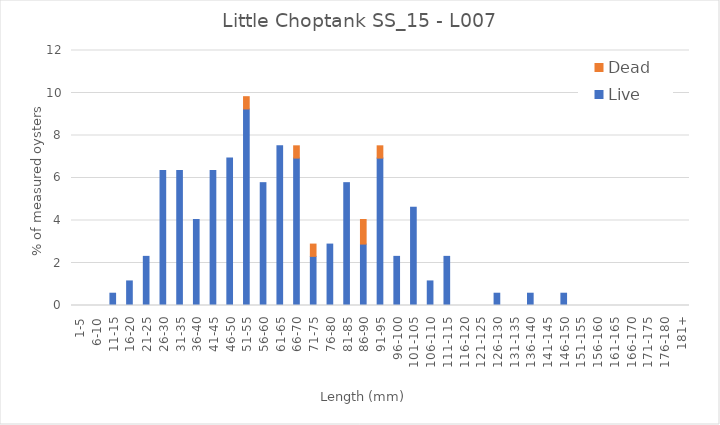
| Category | Live | Dead |
|---|---|---|
| 1-5 | 0 | 0 |
| 6-10 | 0 | 0 |
| 11-15 | 0.578 | 0 |
| 16-20 | 1.156 | 0 |
| 21-25 | 2.312 | 0 |
| 26-30 | 6.358 | 0 |
| 31-35 | 6.358 | 0 |
| 36-40 | 4.046 | 0 |
| 41-45 | 6.358 | 0 |
| 46-50 | 6.936 | 0 |
| 51-55 | 9.249 | 0.578 |
| 56-60 | 5.78 | 0 |
| 61-65 | 7.514 | 0 |
| 66-70 | 6.936 | 0.578 |
| 71-75 | 2.312 | 0.578 |
| 76-80 | 2.89 | 0 |
| 81-85 | 5.78 | 0 |
| 86-90 | 2.89 | 1.156 |
| 91-95 | 6.936 | 0.578 |
| 96-100 | 2.312 | 0 |
| 101-105 | 4.624 | 0 |
| 106-110 | 1.156 | 0 |
| 111-115 | 2.312 | 0 |
| 116-120 | 0 | 0 |
| 121-125 | 0 | 0 |
| 126-130 | 0.578 | 0 |
| 131-135 | 0 | 0 |
| 136-140 | 0.578 | 0 |
| 141-145 | 0 | 0 |
| 146-150 | 0.578 | 0 |
| 151-155 | 0 | 0 |
| 156-160 | 0 | 0 |
| 161-165 | 0 | 0 |
| 166-170 | 0 | 0 |
| 171-175 | 0 | 0 |
| 176-180 | 0 | 0 |
| 181+ | 0 | 0 |